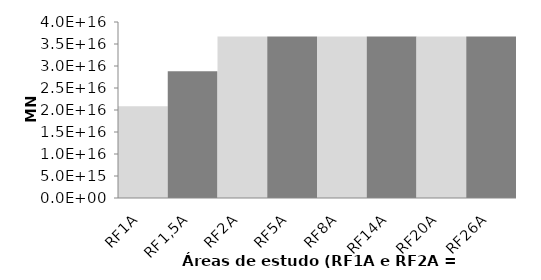
| Category | Series 0 |
|---|---|
| RF1A | 20877633703094140 |
| RF1,5A | 28796051181698484 |
| RF2A | 36714468660302824 |
| RF5A | 36714468660302824 |
| RF8A | 36714468660302824 |
| RF14A | 36714468660302824 |
| RF20A | 36714468660302824 |
| RF26A | 36714468660302824 |